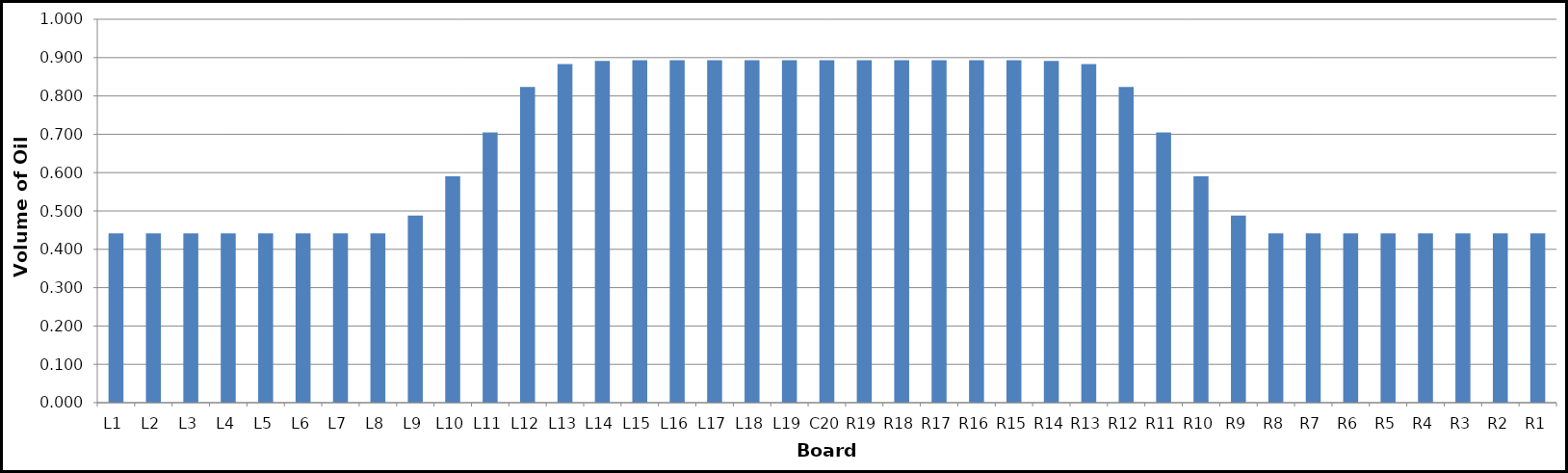
| Category | Series 0 |
|---|---|
| L1 | 0.442 |
| L2 | 0.442 |
| L3 | 0.442 |
| L4 | 0.442 |
| L5 | 0.442 |
| L6 | 0.442 |
| L7 | 0.442 |
| L8 | 0.442 |
| L9 | 0.488 |
| L10 | 0.59 |
| L11 | 0.705 |
| L12 | 0.824 |
| L13 | 0.883 |
| L14 | 0.892 |
| L15 | 0.893 |
| L16 | 0.893 |
| L17 | 0.893 |
| L18 | 0.893 |
| L19 | 0.893 |
| C20 | 0.893 |
| R19 | 0.893 |
| R18 | 0.893 |
| R17 | 0.893 |
| R16 | 0.893 |
| R15 | 0.893 |
| R14 | 0.892 |
| R13 | 0.883 |
| R12 | 0.824 |
| R11 | 0.705 |
| R10 | 0.59 |
| R9 | 0.488 |
| R8 | 0.442 |
| R7 | 0.442 |
| R6 | 0.442 |
| R5 | 0.442 |
| R4 | 0.442 |
| R3 | 0.442 |
| R2 | 0.442 |
| R1 | 0.442 |